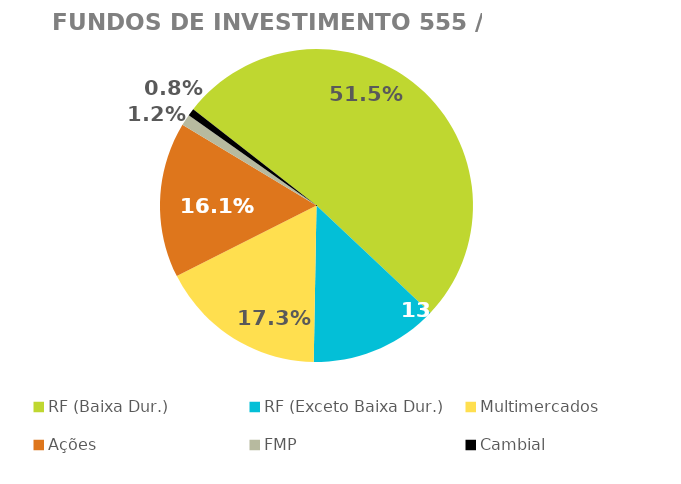
| Category | Fundos de Investimento 555 / FMP |
|---|---|
| RF (Baixa Dur.) | 0.515 |
| RF (Exceto Baixa Dur.) | 0.133 |
| Multimercados | 0.173 |
| Ações | 0.161 |
| FMP | 0.012 |
| Cambial | 0.008 |